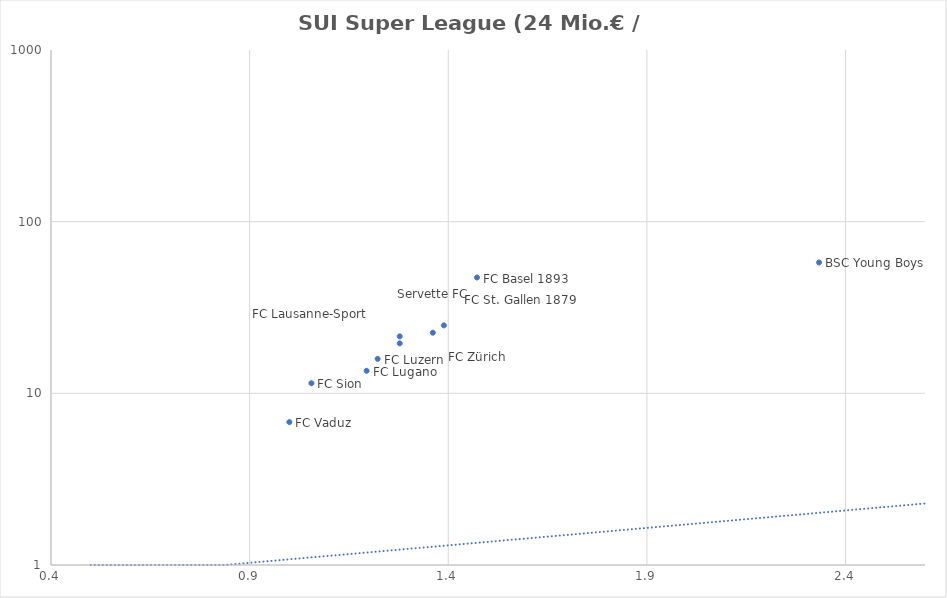
| Category | Series 0 |
|---|---|
| 2.3333333333333335 | 57.85 |
| 1.4722222222222223 | 47.28 |
| 1.3888888888888888 | 24.88 |
| 1.3611111111111112 | 22.55 |
| 1.2777777777777777 | 21.48 |
| 1.2777777777777777 | 19.55 |
| 1.2222222222222223 | 15.88 |
| 1.1944444444444444 | 13.53 |
| 1.0555555555555556 | 11.45 |
| 1.0 | 6.8 |